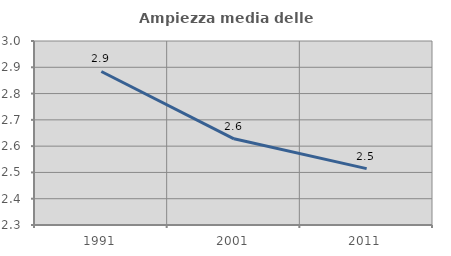
| Category | Ampiezza media delle famiglie |
|---|---|
| 1991.0 | 2.884 |
| 2001.0 | 2.628 |
| 2011.0 | 2.515 |